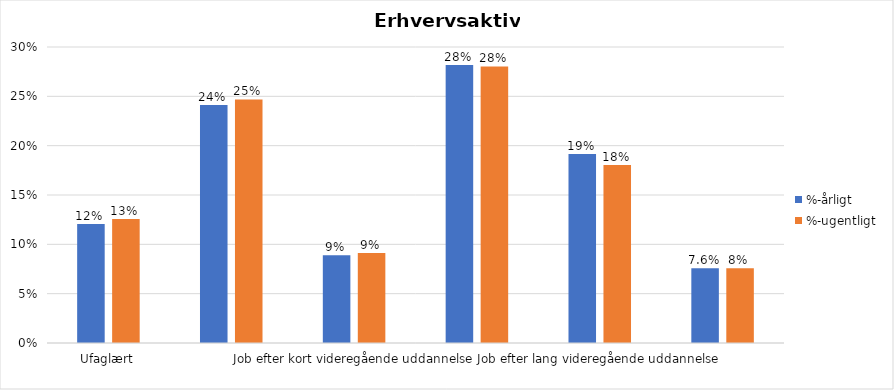
| Category | %-årligt | %-ugentligt |
|---|---|---|
| Ufaglært | 0.121 | 0.126 |
| Erhvervsfagligt job | 0.241 | 0.247 |
| Job efter kort videregående uddannelse | 0.089 | 0.091 |
| Job efter mellemlang videregående uddannelse | 0.282 | 0.28 |
| Job efter lang videregående uddannelse | 0.192 | 0.18 |
| Selvstændig | 0.076 | 0.076 |